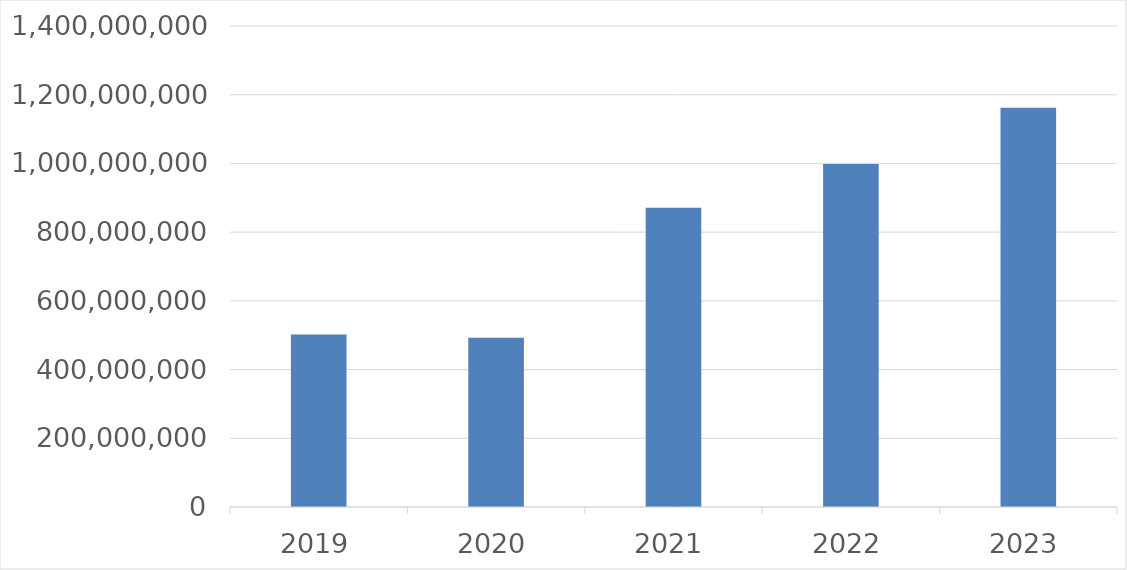
| Category | Series 0 |
|---|---|
| 2019 | 502232993 |
| 2020 | 492673536 |
| 2021 | 871152419 |
| 2022 | 998175134 |
| 2023 | 1161737211 |